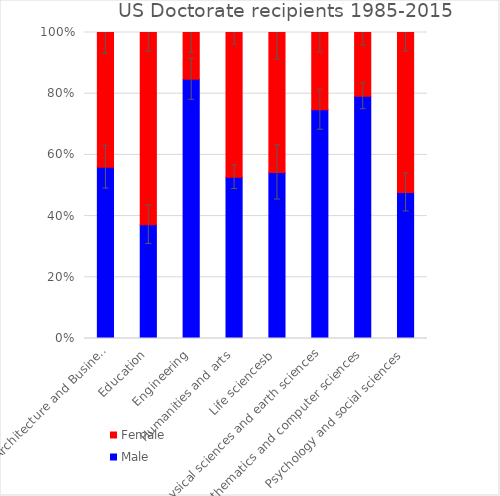
| Category | Male | Female |
|---|---|---|
| Other (inc. Architecture and Business) | 0.56 | 0.44 |
| Education | 0.372 | 0.628 |
| Engineering | 0.847 | 0.153 |
| Humanities and arts | 0.527 | 0.473 |
| Life sciencesb | 0.543 | 0.457 |
| Physical sciences and earth sciences | 0.748 | 0.252 |
| Mathematics and computer sciences | 0.792 | 0.208 |
| Psychology and social sciences | 0.477 | 0.523 |